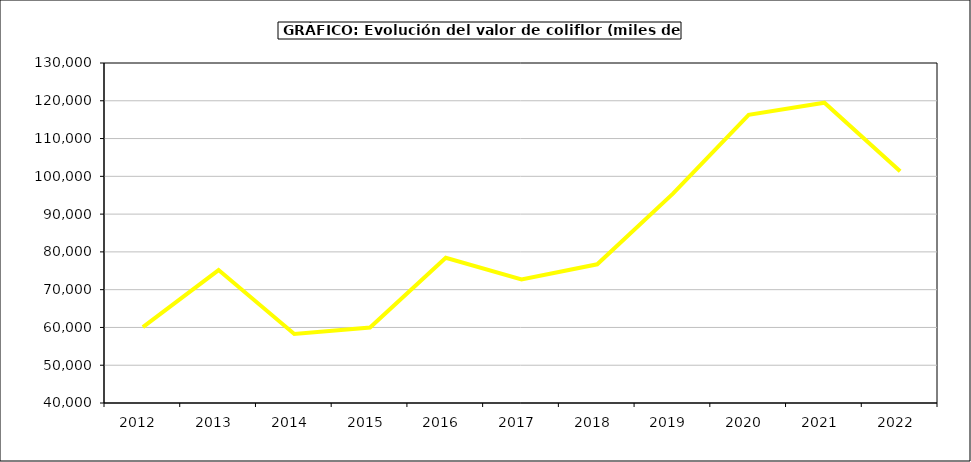
| Category | Valor |
|---|---|
| 2012.0 | 60097.372 |
| 2013.0 | 75196.05 |
| 2014.0 | 58249.149 |
| 2015.0 | 59963 |
| 2016.0 | 78452 |
| 2017.0 | 72692.622 |
| 2018.0 | 76706.611 |
| 2019.0 | 95406.878 |
| 2020.0 | 116287.449 |
| 2021.0 | 119498.934 |
| 2022.0 | 101344.651 |